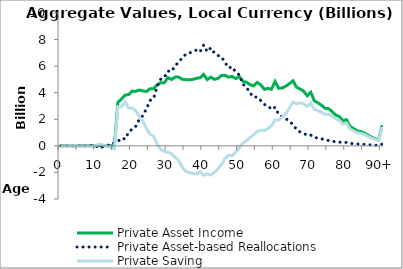
| Category | Private Asset Income | Private Asset-based Reallocations | Private Saving |
|---|---|---|---|
| 0 | 0 | 1.502 | -1.502 |
|  | 0 | 3.111 | -3.111 |
| 2 | 0 | 1.719 | -1.719 |
| 3 | 0 | 0.562 | -0.562 |
| 4 | 0 | -15.955 | 15.955 |
| 5 | 0 | 5.501 | -5.501 |
| 6 | 0 | 2.546 | -2.546 |
| 7 | 0 | 6.954 | -6.954 |
| 8 | 0 | 6.534 | -6.534 |
| 9 | 0 | 56.429 | -56.429 |
| 10 | 0 | -44.951 | 44.951 |
| 11 | 0 | -144.882 | 144.882 |
| 12 | 0 | -53.069 | 53.069 |
| 13 | 0 | 22.846 | -22.846 |
| 14 | 0 | 142.806 | -142.806 |
| 15 | 0 | 231.993 | -231.993 |
| 16 | 3278.716 | 326.138 | 2952.578 |
| 17 | 3524.097 | 585.843 | 2938.253 |
| 18 | 3821.201 | 511.686 | 3309.515 |
| 19 | 3859.014 | 1012.16 | 2846.854 |
| 20 | 4118.546 | 1271.693 | 2846.853 |
| 21 | 4110.153 | 1472.568 | 2637.585 |
| 22 | 4200.762 | 2005.89 | 2194.872 |
| 23 | 4135.213 | 2276.085 | 1859.128 |
| 24 | 4093.462 | 2807.261 | 1286.201 |
| 25 | 4296.468 | 3417.084 | 879.384 |
| 26 | 4306.974 | 3580.012 | 726.962 |
| 27 | 4601.976 | 4486.409 | 115.567 |
| 28 | 4756.499 | 5025.959 | -269.46 |
| 29 | 4755.09 | 5171.336 | -416.246 |
| 30 | 5140.497 | 5630.354 | -489.857 |
| 31 | 4995.149 | 5599.763 | -604.614 |
| 32 | 5174.94 | 6021.618 | -846.677 |
| 33 | 5174.576 | 6291.608 | -1117.031 |
| 34 | 5013.959 | 6629.538 | -1615.579 |
| 35 | 4979.559 | 6890.649 | -1911.09 |
| 36 | 4966.836 | 6994.746 | -2027.91 |
| 37 | 5004.269 | 7082.263 | -2077.994 |
| 38 | 5084.761 | 7215.365 | -2130.604 |
| 39 | 5123.047 | 7077.567 | -1954.52 |
| 40 | 5378.931 | 7590.231 | -2211.3 |
| 41 | 4985.93 | 7089.818 | -2103.888 |
| 42 | 5170.573 | 7373.823 | -2203.25 |
| 43 | 5005.301 | 6992.931 | -1987.63 |
| 44 | 5074.158 | 6805.949 | -1731.791 |
| 45 | 5301.539 | 6692.46 | -1390.921 |
| 46 | 5310.471 | 6272.741 | -962.27 |
| 47 | 5170.309 | 5866.689 | -696.379 |
| 48 | 5223.8 | 5949.645 | -725.845 |
| 49 | 5057.216 | 5534.757 | -477.541 |
| 50 | 5213.277 | 5334.94 | -121.663 |
| 51 | 4853.162 | 4644.702 | 208.46 |
| 52 | 4786.287 | 4410.527 | 375.76 |
| 53 | 4604.911 | 3973.35 | 631.561 |
| 54 | 4508.706 | 3668.947 | 839.759 |
| 55 | 4775.22 | 3676.301 | 1098.919 |
| 56 | 4586.176 | 3407.78 | 1178.396 |
| 57 | 4258.687 | 3117.355 | 1141.332 |
| 58 | 4323.962 | 3014.157 | 1309.805 |
| 59 | 4262.069 | 2743.429 | 1518.639 |
| 60 | 4850.356 | 2904.45 | 1945.906 |
| 61 | 4329.769 | 2374.734 | 1955.035 |
| 62 | 4356.318 | 2193.589 | 2162.729 |
| 63 | 4492.103 | 2055.03 | 2437.073 |
| 64 | 4678.129 | 1843.859 | 2834.27 |
| 65 | 4896.95 | 1607.388 | 3289.563 |
| 66 | 4420.623 | 1241.46 | 3179.164 |
| 67 | 4280.559 | 1045.612 | 3234.947 |
| 68 | 4116.741 | 949.055 | 3167.686 |
| 69 | 3773.034 | 796.113 | 2976.922 |
| 70 | 4035.809 | 811.14 | 3224.669 |
| 71 | 3388.12 | 640.53 | 2747.59 |
| 72 | 3235.419 | 582.366 | 2653.053 |
| 73 | 3061.566 | 532.748 | 2528.818 |
| 74 | 2825.084 | 450.589 | 2374.495 |
| 75 | 2800.715 | 405.862 | 2394.853 |
| 76 | 2577.463 | 348.859 | 2228.603 |
| 77 | 2311.642 | 298.752 | 2012.89 |
| 78 | 2209.387 | 282.653 | 1926.735 |
| 79 | 1883.251 | 242.7 | 1640.551 |
| 80 | 1970.43 | 259.129 | 1711.301 |
| 81 | 1458.803 | 189.574 | 1269.23 |
| 82 | 1294.881 | 164.756 | 1130.124 |
| 83 | 1132.201 | 140.668 | 991.533 |
| 84 | 1069.959 | 128.832 | 941.127 |
| 85 | 968.005 | 108.15 | 859.854 |
| 86 | 799.357 | 84.75 | 714.607 |
| 87 | 652.597 | 66.366 | 586.231 |
| 88 | 539.334 | 52.179 | 487.155 |
| 89 | 435.202 | 40.219 | 394.983 |
| 90+ | 1563.685 | 129.379 | 1434.306 |